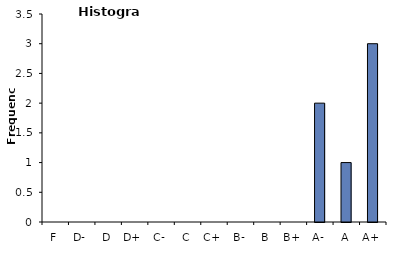
| Category | Grade |
|---|---|
| F | 0 |
| D- | 0 |
| D | 0 |
| D+ | 0 |
| C- | 0 |
| C | 0 |
| C+ | 0 |
| B- | 0 |
| B | 0 |
| B+ | 0 |
| A- | 2 |
| A | 1 |
| A+ | 3 |